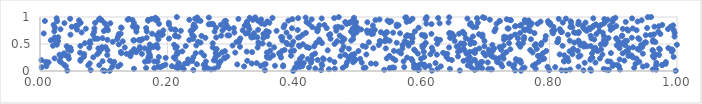
| Category | Series 0 |
|---|---|
| 0.3973890300934705 | 0.001 |
| 0.10145602287261213 | 0.002 |
| 0.10938902894747482 | 0.003 |
| 0.9979287383492613 | 0.004 |
| 0.7550871825981512 | 0.005 |
| 0.8651011881730192 | 0.006 |
| 0.6151875255150676 | 0.007 |
| 0.04285579661755712 | 0.008 |
| 0.8256534036813181 | 0.009 |
| 0.6589906973198936 | 0.01 |
| 0.7458257447315919 | 0.011 |
| 0.09906653998265813 | 0.012 |
| 0.8532120015228254 | 0.013 |
| 0.8187321625131625 | 0.014 |
| 0.3530781050278349 | 0.015 |
| 0.07954421915733279 | 0.016 |
| 0.7993456024274581 | 0.017 |
| 0.44116968283283975 | 0.018 |
| 0.24075158020275111 | 0.019 |
| 0.8928718810633416 | 0.02 |
| 0.6824224259435289 | 0.021 |
| 0.5934443066041453 | 0.022 |
| 0.5403308627490837 | 0.023 |
| 0.5947688931778354 | 0.024 |
| 0.9672745493603312 | 0.025 |
| 0.8888726562219799 | 0.026 |
| 0.9104271045630057 | 0.027 |
| 0.8322260000957703 | 0.028 |
| 0.2684752750521874 | 0.029 |
| 0.9618760338702196 | 0.03 |
| 0.7094858580460742 | 0.031 |
| 0.707569745450671 | 0.032 |
| 0.45365844930138577 | 0.033 |
| 0.8639271718592456 | 0.034 |
| 0.22567820221675283 | 0.035 |
| 0.7037346549840656 | 0.036 |
| 0.88496714286085 | 0.037 |
| 0.7781785855373956 | 0.038 |
| 0.6435621071395337 | 0.039 |
| 0.2583855647682398 | 0.04 |
| 0.14751264766658712 | 0.041 |
| 0.6241201028423417 | 0.042 |
| 0.4627803217535582 | 0.043 |
| 0.2738290032569164 | 0.044 |
| 0.6861048178813566 | 0.045 |
| 0.40122592603179963 | 0.046 |
| 0.43225511103234204 | 0.047 |
| 0.26358884745372324 | 0.048 |
| 0.21643727218727848 | 0.049 |
| 0.6941253898320315 | 0.05 |
| 0.5488991173098302 | 0.051 |
| 0.5490511297791335 | 0.052 |
| 0.758115351155932 | 0.053 |
| 0.17940014670018656 | 0.054 |
| 0.5082286117844772 | 0.055 |
| 0.16652284784157512 | 0.056 |
| 0.475308242299199 | 0.057 |
| 0.5871527133227742 | 0.058 |
| 0.9328075154947474 | 0.059 |
| 0.5560142840199664 | 0.06 |
| 0.40018071368963126 | 0.061 |
| 0.5110332690001114 | 0.062 |
| 0.760661549129893 | 0.063 |
| 0.6774669429533051 | 0.064 |
| 0.42231116567984095 | 0.065 |
| 0.5534748143618415 | 0.066 |
| 0.6915551657857393 | 0.067 |
| 0.22281446626942258 | 0.068 |
| 0.0026749785477455656 | 0.069 |
| 0.2133401913778462 | 0.07 |
| 0.189331830713528 | 0.071 |
| 0.8087822555828863 | 0.072 |
| 0.5716930328252531 | 0.073 |
| 0.6045163035065559 | 0.074 |
| 0.11326421852560375 | 0.075 |
| 0.7431013725020342 | 0.076 |
| 0.7967940664056057 | 0.077 |
| 0.40811481394989224 | 0.078 |
| 0.18508805564644926 | 0.079 |
| 0.27973770962019706 | 0.08 |
| 0.8454093880061371 | 0.081 |
| 0.9464673682434231 | 0.082 |
| 0.12245245344614208 | 0.083 |
| 0.7257016643789395 | 0.084 |
| 0.3203823394865567 | 0.085 |
| 0.629203401628143 | 0.086 |
| 0.38161837606238713 | 0.087 |
| 0.009916527906365769 | 0.088 |
| 0.908820807589899 | 0.089 |
| 0.2071487086372088 | 0.09 |
| 0.04060345580844216 | 0.091 |
| 0.4119835595408259 | 0.092 |
| 0.8988826517035206 | 0.093 |
| 0.19262887759247127 | 0.094 |
| 0.3466352136328644 | 0.095 |
| 0.611175892741034 | 0.096 |
| 0.36887123864116456 | 0.097 |
| 0.773905971472521 | 0.098 |
| 0.48027553786927235 | 0.099 |
| 0.5880555412174588 | 0.1 |
| 0.9525595859216636 | 0.101 |
| 0.4430464527832557 | 0.102 |
| 0.6716658288979078 | 0.103 |
| 0.38182845084281014 | 0.104 |
| 0.07567542942910077 | 0.105 |
| 0.9671789432071264 | 0.106 |
| 0.25904430145853885 | 0.107 |
| 0.09304020302335148 | 0.108 |
| 0.5946309707061453 | 0.109 |
| 0.9764075352348847 | 0.11 |
| 0.9062347305359234 | 0.111 |
| 0.9769137925200968 | 0.112 |
| 0.03816731025732267 | 0.113 |
| 0.2570113969868424 | 0.114 |
| 0.9010929060371862 | 0.115 |
| 0.12614102030482277 | 0.116 |
| 0.19682568250456112 | 0.117 |
| 0.7446346787106743 | 0.118 |
| 0.35142635464302496 | 0.119 |
| 0.6030938679835922 | 0.12 |
| 0.587202962025347 | 0.121 |
| 0.3096959108628322 | 0.122 |
| 0.690602832838305 | 0.123 |
| 0.5990926979542246 | 0.124 |
| 0.24641735209581006 | 0.125 |
| 0.010204410726921576 | 0.126 |
| 0.7777023491361135 | 0.127 |
| 0.4422638187113713 | 0.128 |
| 0.3542026295881464 | 0.129 |
| 0.6867395868835099 | 0.13 |
| 0.7234612327696814 | 0.131 |
| 0.9821886626398322 | 0.132 |
| 0.9348633887324656 | 0.133 |
| 0.5271459145736731 | 0.134 |
| 0.2174484284228464 | 0.135 |
| 0.7365832951509551 | 0.136 |
| 0.2274904761094142 | 0.137 |
| 0.3324327584315885 | 0.138 |
| 0.5195562015952441 | 0.139 |
| 0.2811150217462426 | 0.14 |
| 0.078095846898248 | 0.141 |
| 0.2319896897481747 | 0.142 |
| 0.40341349849653485 | 0.143 |
| 0.11503547962010086 | 0.144 |
| 0.21774230094317193 | 0.145 |
| 0.3402022332006057 | 0.146 |
| 0.6209273542612286 | 0.147 |
| 0.4140210646399316 | 0.148 |
| 0.4089701833194831 | 0.149 |
| 0.675418269837891 | 0.15 |
| 0.8551768060563761 | 0.151 |
| 0.9676191269089826 | 0.152 |
| 0.7550559186915174 | 0.153 |
| 0.4255651523685987 | 0.154 |
| 0.8719721124673732 | 0.155 |
| 0.5050844273906981 | 0.156 |
| 0.481778180729172 | 0.157 |
| 0.6750157099241024 | 0.158 |
| 0.7029610863962495 | 0.159 |
| 0.013451368009915754 | 0.16 |
| 0.03308600107930715 | 0.161 |
| 0.6920163198471202 | 0.162 |
| 0.49157329937958494 | 0.163 |
| 0.7177489573184356 | 0.164 |
| 0.46219662474729983 | 0.165 |
| 0.982543032630548 | 0.166 |
| 0.6940521125809695 | 0.167 |
| 0.009414532098761086 | 0.168 |
| 0.940906285028634 | 0.169 |
| 0.1164376687986991 | 0.17 |
| 0.7829066478190443 | 0.171 |
| 0.16485355403345336 | 0.172 |
| 0.184383923631245 | 0.173 |
| 0.8954614719898409 | 0.174 |
| 0.2604272317376852 | 0.175 |
| 0.8228927831098108 | 0.176 |
| 0.1794203277832177 | 0.177 |
| 0.5708476193371623 | 0.178 |
| 0.8910932345505453 | 0.179 |
| 0.2835905377258534 | 0.18 |
| 0.09824244734787302 | 0.181 |
| 0.8295917249789947 | 0.182 |
| 0.23913116355366226 | 0.183 |
| 0.17063496904379805 | 0.184 |
| 0.751781490639659 | 0.185 |
| 0.030810477360781907 | 0.186 |
| 0.8226740512913617 | 0.187 |
| 0.6648712404135151 | 0.188 |
| 0.32533395828896117 | 0.189 |
| 0.06346988593470804 | 0.19 |
| 0.10987450387874598 | 0.191 |
| 0.9172856454501171 | 0.192 |
| 0.584625279258606 | 0.193 |
| 0.751525110553338 | 0.194 |
| 0.7540433153995727 | 0.195 |
| 0.4943595655836803 | 0.196 |
| 0.2753086449304737 | 0.197 |
| 0.27285463376756525 | 0.198 |
| 0.6825904118526183 | 0.199 |
| 0.5578271225796889 | 0.2 |
| 0.002246080789714333 | 0.201 |
| 0.6713823735912484 | 0.202 |
| 0.646535633267846 | 0.203 |
| 0.43586939820124626 | 0.204 |
| 0.7484751715081891 | 0.205 |
| 0.6822977471403491 | 0.206 |
| 0.8639545973619948 | 0.207 |
| 0.42653312891112616 | 0.208 |
| 0.45484536131521625 | 0.209 |
| 0.7174143320900994 | 0.21 |
| 0.4947664115720224 | 0.211 |
| 0.06376969637438523 | 0.212 |
| 0.6708260857519641 | 0.213 |
| 0.9099328152187598 | 0.214 |
| 0.2325076434948813 | 0.215 |
| 0.48489066487907095 | 0.216 |
| 0.4454926922011826 | 0.217 |
| 0.788468973375737 | 0.218 |
| 0.7470340427078472 | 0.219 |
| 0.6412632635913377 | 0.22 |
| 0.40790820308068076 | 0.221 |
| 0.4204415963001794 | 0.222 |
| 0.583056343523627 | 0.223 |
| 0.5025652252828215 | 0.224 |
| 0.5981376066807192 | 0.225 |
| 0.21243249224731164 | 0.226 |
| 0.791598785904893 | 0.227 |
| 0.04530472403968022 | 0.228 |
| 0.7277330940322179 | 0.229 |
| 0.9365125718755333 | 0.23 |
| 0.8789301767186906 | 0.231 |
| 0.55397011181296 | 0.232 |
| 0.5444168402105094 | 0.233 |
| 0.022896603686551997 | 0.234 |
| 0.4443409592146642 | 0.235 |
| 0.49305523914700744 | 0.236 |
| 0.2901829827517515 | 0.237 |
| 0.8652592136881416 | 0.238 |
| 0.7209865811816288 | 0.239 |
| 0.17001039016900388 | 0.24 |
| 0.7147558268504596 | 0.241 |
| 0.8280771117708514 | 0.242 |
| 0.1972653000560427 | 0.243 |
| 0.8672152449578839 | 0.244 |
| 0.3608749525074145 | 0.245 |
| 0.28924707592704335 | 0.246 |
| 0.9639006803812122 | 0.247 |
| 0.3569770018456815 | 0.248 |
| 0.5762532062652346 | 0.249 |
| 0.37839895123611467 | 0.25 |
| 0.931044567622365 | 0.251 |
| 0.674840976450389 | 0.252 |
| 0.2100841618336915 | 0.253 |
| 0.08369248083093284 | 0.254 |
| 0.24083079958340825 | 0.255 |
| 0.2754652444287309 | 0.256 |
| 0.17290394707578516 | 0.257 |
| 0.48421197947309513 | 0.258 |
| 0.1865065915041786 | 0.259 |
| 0.6030211537272209 | 0.26 |
| 0.9946724209780581 | 0.261 |
| 0.6379561413128684 | 0.262 |
| 0.06878935712216727 | 0.263 |
| 0.8454492311269639 | 0.264 |
| 0.7101639881402737 | 0.265 |
| 0.4115312797304721 | 0.266 |
| 0.03309007013935905 | 0.267 |
| 0.9294963371828189 | 0.268 |
| 0.35621032602449954 | 0.269 |
| 0.6562402772303452 | 0.27 |
| 0.29394386662578853 | 0.271 |
| 0.7829494303655868 | 0.272 |
| 0.17064063770301774 | 0.273 |
| 0.47150272680496796 | 0.274 |
| 0.14195063845359013 | 0.275 |
| 0.9620606320501099 | 0.276 |
| 0.35692365228627887 | 0.277 |
| 0.4889726659104988 | 0.278 |
| 0.9238091342269705 | 0.279 |
| 0.7817343880154757 | 0.28 |
| 0.04427176761384255 | 0.281 |
| 0.548480799211173 | 0.282 |
| 0.39405986752861843 | 0.283 |
| 0.7859449765069385 | 0.284 |
| 0.8483390068315592 | 0.285 |
| 0.25766859874512704 | 0.286 |
| 0.6993406904449877 | 0.287 |
| 0.9287424164613358 | 0.288 |
| 0.04034537586305409 | 0.289 |
| 0.3659029211153235 | 0.29 |
| 0.8230993061572326 | 0.291 |
| 0.4273334249860188 | 0.292 |
| 0.7270811539739932 | 0.293 |
| 0.7073315723548954 | 0.294 |
| 0.37707926175297213 | 0.295 |
| 0.1055760973498292 | 0.296 |
| 0.1723432551755052 | 0.297 |
| 0.971939770960243 | 0.298 |
| 0.27999542972695646 | 0.299 |
| 0.4896363057827797 | 0.3 |
| 0.4789237041286851 | 0.301 |
| 0.030586605003563694 | 0.302 |
| 0.6230845306472231 | 0.303 |
| 0.708672197558105 | 0.304 |
| 0.8828905920255028 | 0.305 |
| 0.5123239055725933 | 0.306 |
| 0.8157809379101644 | 0.307 |
| 0.9664326245752145 | 0.308 |
| 0.21483525593957986 | 0.309 |
| 0.6127774413040399 | 0.31 |
| 0.8359206642177892 | 0.311 |
| 0.09006061791952813 | 0.312 |
| 0.06935641821394622 | 0.313 |
| 0.4936053861037142 | 0.314 |
| 0.6369645886667064 | 0.315 |
| 0.16007230527985328 | 0.316 |
| 0.6392793442134181 | 0.317 |
| 0.13576522811861458 | 0.318 |
| 0.1429036847134686 | 0.319 |
| 0.6696117089489002 | 0.32 |
| 0.9463946329642846 | 0.321 |
| 0.593233816775882 | 0.322 |
| 0.4319185622511108 | 0.323 |
| 0.8665987955923508 | 0.324 |
| 0.5668143751740112 | 0.325 |
| 0.03752156666347328 | 0.326 |
| 0.9146886863804568 | 0.327 |
| 0.127628596173044 | 0.328 |
| 0.7895108970783938 | 0.329 |
| 0.2443871403256196 | 0.33 |
| 0.3754233395462361 | 0.331 |
| 0.8962344326919324 | 0.332 |
| 0.275763803612576 | 0.333 |
| 0.682801993136227 | 0.334 |
| 0.6961651919289874 | 0.335 |
| 0.2153821963668705 | 0.336 |
| 0.6327848042572735 | 0.337 |
| 0.21614856525654624 | 0.338 |
| 0.06299319359012823 | 0.339 |
| 0.253247029100245 | 0.34 |
| 0.3065090771523161 | 0.341 |
| 0.35617985939376096 | 0.342 |
| 0.773307871210165 | 0.343 |
| 0.28575272082457315 | 0.344 |
| 0.21729277907887934 | 0.345 |
| 0.14291040567406033 | 0.346 |
| 0.7319627111675007 | 0.347 |
| 0.09274929539473742 | 0.348 |
| 0.15114289331404562 | 0.349 |
| 0.33304843473911594 | 0.35 |
| 0.17064594765352692 | 0.351 |
| 0.7050651064645282 | 0.352 |
| 0.674826873803619 | 0.353 |
| 0.12706989509531574 | 0.354 |
| 0.6562725834432711 | 0.355 |
| 0.6025323592239172 | 0.356 |
| 0.9919432249948831 | 0.357 |
| 0.6799278636254865 | 0.358 |
| 0.32458903673554296 | 0.359 |
| 0.9229926321146426 | 0.36 |
| 0.5626174064286126 | 0.361 |
| 0.9199506763841483 | 0.362 |
| 0.14846612186496644 | 0.363 |
| 0.22347575756811922 | 0.364 |
| 0.8313425392409092 | 0.365 |
| 0.39394018022839705 | 0.366 |
| 0.8751477484426543 | 0.367 |
| 0.29024903673475466 | 0.368 |
| 0.37971753894644567 | 0.369 |
| 0.49993130288988363 | 0.37 |
| 0.7947267313499472 | 0.371 |
| 0.5556165427270585 | 0.372 |
| 0.36109725447039 | 0.373 |
| 0.844189891714207 | 0.374 |
| 0.6166525414963135 | 0.375 |
| 0.5889249072246022 | 0.376 |
| 0.6665856548392279 | 0.377 |
| 0.3987635868992512 | 0.378 |
| 0.048630657257007104 | 0.379 |
| 0.6598199404584998 | 0.38 |
| 0.10591554854132557 | 0.381 |
| 0.9617540711517368 | 0.382 |
| 0.45165471411401914 | 0.383 |
| 0.9618682167496141 | 0.384 |
| 0.7113135065376645 | 0.385 |
| 0.9932234923411836 | 0.386 |
| 0.47372701854165955 | 0.387 |
| 0.6836272011435807 | 0.388 |
| 0.7696095233249683 | 0.389 |
| 0.38405063386411187 | 0.39 |
| 0.8696287249266644 | 0.391 |
| 0.7240579696557291 | 0.392 |
| 0.9403696100111953 | 0.393 |
| 0.044366467830644685 | 0.394 |
| 0.7045815028116464 | 0.395 |
| 0.5874285958137483 | 0.396 |
| 0.8374969914061838 | 0.397 |
| 0.9731868473456327 | 0.398 |
| 0.276400019912901 | 0.399 |
| 0.8809354586755825 | 0.4 |
| 0.9919040395669667 | 0.401 |
| 0.7383430520137717 | 0.402 |
| 0.09610538250552114 | 0.403 |
| 0.14752596551423458 | 0.404 |
| 0.17115759314708956 | 0.405 |
| 0.1560662567635167 | 0.406 |
| 0.27725324990449907 | 0.407 |
| 0.779872790348918 | 0.408 |
| 0.938207488639319 | 0.409 |
| 0.17037904142136706 | 0.41 |
| 0.8370339686289303 | 0.411 |
| 0.6647735479899498 | 0.412 |
| 0.48491310102930807 | 0.413 |
| 0.9719636637697403 | 0.414 |
| 0.5688671587426839 | 0.415 |
| 0.7128226594625063 | 0.416 |
| 0.6897247922349822 | 0.417 |
| 0.5428238951522646 | 0.418 |
| 0.09163165168834175 | 0.419 |
| 0.1643899780761321 | 0.42 |
| 0.5233023341361728 | 0.421 |
| 0.9239260606177988 | 0.422 |
| 0.9097442119982047 | 0.423 |
| 0.2127412297362946 | 0.424 |
| 0.9864253055338219 | 0.425 |
| 0.04596062261779377 | 0.426 |
| 0.8719732495423856 | 0.427 |
| 0.4222621656943887 | 0.428 |
| 0.04792674564293631 | 0.429 |
| 0.6152234515998372 | 0.43 |
| 0.1847626954484003 | 0.431 |
| 0.07754885897612163 | 0.432 |
| 0.6007821287650283 | 0.433 |
| 0.34156584682373026 | 0.434 |
| 0.13313503159802886 | 0.435 |
| 0.6421998776568741 | 0.436 |
| 0.3675426856690237 | 0.437 |
| 0.27114877768148904 | 0.438 |
| 0.9309098298665072 | 0.439 |
| 0.10311093670308491 | 0.44 |
| 0.09742488806075089 | 0.441 |
| 0.7212101424490905 | 0.442 |
| 0.1566255435826024 | 0.443 |
| 0.4187408843792787 | 0.444 |
| 0.9455181165622801 | 0.445 |
| 0.2147468761371527 | 0.446 |
| 0.1776777830990468 | 0.447 |
| 0.31390510830214957 | 0.448 |
| 0.5114044696743615 | 0.449 |
| 0.7540324643619813 | 0.45 |
| 0.47673577503403464 | 0.451 |
| 0.8539543009968501 | 0.452 |
| 0.654085208938723 | 0.453 |
| 0.1783739141233689 | 0.454 |
| 0.4074014646908828 | 0.455 |
| 0.4303752096246436 | 0.456 |
| 0.8587861864557532 | 0.457 |
| 0.6976714462392464 | 0.458 |
| 0.04195108350560339 | 0.459 |
| 0.18240350663330962 | 0.46 |
| 0.8646882493384931 | 0.461 |
| 0.6567938529496764 | 0.462 |
| 0.228742294858706 | 0.463 |
| 0.06335442219267884 | 0.464 |
| 0.5067560421672062 | 0.465 |
| 0.8203655973808036 | 0.466 |
| 0.6001151488592288 | 0.467 |
| 0.02033894374393652 | 0.468 |
| 0.5786468350446068 | 0.469 |
| 0.3023135697350441 | 0.47 |
| 0.7277561524623939 | 0.471 |
| 0.4065195594704344 | 0.472 |
| 0.24539280068514857 | 0.473 |
| 0.9053340868216266 | 0.474 |
| 0.8483513025830046 | 0.475 |
| 0.7765879908081814 | 0.476 |
| 0.39500881551592215 | 0.477 |
| 0.943509533340976 | 0.478 |
| 0.6031369362883692 | 0.479 |
| 0.5691220282154562 | 0.48 |
| 0.5318941696084288 | 0.481 |
| 0.9182110236835637 | 0.482 |
| 0.7100520376222323 | 0.483 |
| 0.7864576615616226 | 0.484 |
| 0.21055065990098432 | 0.485 |
| 0.9998072082136817 | 0.486 |
| 0.026482647693172212 | 0.487 |
| 0.18324463335402097 | 0.488 |
| 0.6653264247731757 | 0.489 |
| 0.17234022703271523 | 0.49 |
| 0.36000738007558675 | 0.491 |
| 0.12364227264364602 | 0.492 |
| 0.8865773308465872 | 0.493 |
| 0.8804859333679809 | 0.494 |
| 0.4127880162272851 | 0.495 |
| 0.7515253737674206 | 0.496 |
| 0.7781449115337115 | 0.497 |
| 0.34345956956277435 | 0.498 |
| 0.3880911651059029 | 0.499 |
| 0.46255622420838105 | 0.5 |
| 0.6756566269398679 | 0.501 |
| 0.9475931343000988 | 0.502 |
| 0.8480802066132559 | 0.503 |
| 0.623758307224823 | 0.504 |
| 0.9137291859095669 | 0.505 |
| 0.5773003255849096 | 0.506 |
| 0.8538709190381238 | 0.507 |
| 0.07900026977174801 | 0.508 |
| 0.3494758452845552 | 0.509 |
| 0.7513846484782613 | 0.51 |
| 0.6603970433943579 | 0.511 |
| 0.6655243632614092 | 0.512 |
| 0.2712032174323372 | 0.513 |
| 0.7580077825666155 | 0.514 |
| 0.07044716259300188 | 0.515 |
| 0.7362980801219308 | 0.516 |
| 0.44261000745595636 | 0.517 |
| 0.7873713894372607 | 0.518 |
| 0.6818195467518537 | 0.519 |
| 0.6055932280262645 | 0.52 |
| 0.4336679950492791 | 0.521 |
| 0.38704763681675247 | 0.522 |
| 0.5600331611408789 | 0.523 |
| 0.5763318916253961 | 0.524 |
| 0.838867452565219 | 0.525 |
| 0.9162266747359001 | 0.526 |
| 0.25211414156106327 | 0.527 |
| 0.9512289680547825 | 0.528 |
| 0.8882298402681155 | 0.529 |
| 0.3428491963149619 | 0.53 |
| 0.9501185602035822 | 0.531 |
| 0.5162696328052538 | 0.532 |
| 0.8120094220764562 | 0.533 |
| 0.5840535842613628 | 0.534 |
| 0.44128646011368466 | 0.535 |
| 0.9660032253948498 | 0.536 |
| 0.3085139140353603 | 0.537 |
| 0.908785448571468 | 0.538 |
| 0.2479185399145205 | 0.539 |
| 0.1142761325134255 | 0.54 |
| 0.4745416541406282 | 0.541 |
| 0.3976234065628744 | 0.542 |
| 0.8459283301716446 | 0.543 |
| 0.9620725040835086 | 0.544 |
| 0.8130451747635606 | 0.545 |
| 0.5351634593584823 | 0.546 |
| 0.31264436706795773 | 0.547 |
| 0.07819827054749084 | 0.548 |
| 0.12983359539351036 | 0.549 |
| 0.5724242421237797 | 0.55 |
| 0.46646203075560266 | 0.551 |
| 0.6766192562532798 | 0.552 |
| 0.5416131777549861 | 0.553 |
| 0.028303092310702382 | 0.554 |
| 0.5332972871947745 | 0.555 |
| 0.697761434415247 | 0.556 |
| 0.6509459203894843 | 0.557 |
| 0.9190876983220727 | 0.558 |
| 0.9214128742163362 | 0.559 |
| 0.02392631469236073 | 0.56 |
| 0.5489037236238329 | 0.561 |
| 0.8317046666263581 | 0.562 |
| 0.8452830208090985 | 0.563 |
| 0.48856887316629505 | 0.564 |
| 0.38043027189533807 | 0.565 |
| 0.15795165367895114 | 0.566 |
| 0.14761255834656728 | 0.567 |
| 0.1465473878796688 | 0.568 |
| 0.01699107091000518 | 0.569 |
| 0.5456866558004263 | 0.57 |
| 0.8852695285851823 | 0.571 |
| 0.9625430885312298 | 0.572 |
| 0.23434804215817673 | 0.573 |
| 0.15516560751455577 | 0.574 |
| 0.6743842587762806 | 0.575 |
| 0.6280009831627434 | 0.576 |
| 0.1564875151809184 | 0.577 |
| 0.10589442649855418 | 0.578 |
| 0.3132842036502287 | 0.579 |
| 0.72826881805406 | 0.58 |
| 0.7932007732564699 | 0.581 |
| 0.9060919956010399 | 0.582 |
| 0.438462959393928 | 0.583 |
| 0.8701363179164149 | 0.584 |
| 0.7595333939577524 | 0.585 |
| 0.9410060151937535 | 0.586 |
| 0.1858910243345916 | 0.587 |
| 0.7707666540131956 | 0.588 |
| 0.6225733279090144 | 0.589 |
| 0.1606661557151582 | 0.59 |
| 0.4778304050452026 | 0.591 |
| 0.49150570527232207 | 0.592 |
| 0.12121365726034039 | 0.593 |
| 0.5431684753400399 | 0.594 |
| 0.2401731308382552 | 0.595 |
| 0.8137285894858278 | 0.596 |
| 0.45615070900670673 | 0.597 |
| 0.09066686286729508 | 0.598 |
| 0.08545651535032728 | 0.599 |
| 0.20256921651197812 | 0.6 |
| 0.08736506622750762 | 0.601 |
| 0.865593764565939 | 0.602 |
| 0.584788035983968 | 0.603 |
| 0.3144763253121782 | 0.604 |
| 0.7503271343632698 | 0.605 |
| 0.9044485638073959 | 0.606 |
| 0.09799144514236657 | 0.607 |
| 0.9392149956947876 | 0.608 |
| 0.350536316206859 | 0.609 |
| 0.6684579666895115 | 0.61 |
| 0.8924925242435026 | 0.611 |
| 0.6439148837577517 | 0.612 |
| 0.7365591158575835 | 0.613 |
| 0.4750844723202108 | 0.614 |
| 0.2596990541466473 | 0.615 |
| 0.16747508790636756 | 0.616 |
| 0.9290669774409953 | 0.617 |
| 0.4052721475779597 | 0.618 |
| 0.33199594389552756 | 0.619 |
| 0.5841798649380661 | 0.62 |
| 0.27661383665643313 | 0.621 |
| 0.022910418326809845 | 0.622 |
| 0.7319191942671168 | 0.623 |
| 0.38042259047546845 | 0.624 |
| 0.028518637067446284 | 0.625 |
| 0.3410752595531523 | 0.626 |
| 0.40779966536503676 | 0.627 |
| 0.7600722964089356 | 0.628 |
| 0.37850144492791127 | 0.629 |
| 0.3360777450807447 | 0.63 |
| 0.3918876707606853 | 0.631 |
| 0.6946433828477304 | 0.632 |
| 0.12250640909648525 | 0.633 |
| 0.6044258413221374 | 0.634 |
| 0.728666542609051 | 0.635 |
| 0.2173561783605421 | 0.636 |
| 0.9961148818668983 | 0.637 |
| 0.24154207654848092 | 0.638 |
| 0.7392497117272337 | 0.639 |
| 0.6796241222854187 | 0.64 |
| 0.33170085685207784 | 0.641 |
| 0.5745771450091467 | 0.642 |
| 0.33254990977373866 | 0.643 |
| 0.3566935701284556 | 0.644 |
| 0.9134059006468113 | 0.645 |
| 0.21235295966307954 | 0.646 |
| 0.7939074525947711 | 0.647 |
| 0.5806471401400327 | 0.648 |
| 0.8851432309984886 | 0.649 |
| 0.6496762793092717 | 0.65 |
| 0.25355510527562397 | 0.651 |
| 0.5843487857462876 | 0.652 |
| 0.8645387806756385 | 0.653 |
| 0.28438054098830745 | 0.654 |
| 0.4705057192513026 | 0.655 |
| 0.9140428148562313 | 0.656 |
| 0.6936722357543695 | 0.657 |
| 0.2971076860265637 | 0.658 |
| 0.18332122262931472 | 0.659 |
| 0.2942916114253946 | 0.66 |
| 0.21221390362814385 | 0.661 |
| 0.6037771662468244 | 0.662 |
| 0.950948565415824 | 0.663 |
| 0.5765482369671578 | 0.664 |
| 0.190840981935524 | 0.665 |
| 0.4921787540677355 | 0.666 |
| 0.45372046445869874 | 0.667 |
| 0.599485156696513 | 0.668 |
| 0.9584339490173327 | 0.669 |
| 0.23893268827128622 | 0.67 |
| 0.8287486585039572 | 0.671 |
| 0.41241003001249366 | 0.672 |
| 0.047847687162653196 | 0.673 |
| 0.6946578581330655 | 0.674 |
| 0.7456988955832362 | 0.675 |
| 0.08336793227943873 | 0.676 |
| 0.1926647192984583 | 0.677 |
| 0.963804012571109 | 0.678 |
| 0.541215234997536 | 0.679 |
| 0.6891275581516056 | 0.68 |
| 0.45579747446426455 | 0.681 |
| 0.12363215741094957 | 0.682 |
| 0.520815211176421 | 0.683 |
| 0.35066261322648207 | 0.684 |
| 0.8734912928209343 | 0.685 |
| 0.973877209072386 | 0.686 |
| 0.6662082376220684 | 0.687 |
| 0.6144525639616807 | 0.688 |
| 0.657934537122582 | 0.689 |
| 0.17600877832033457 | 0.69 |
| 0.1266704717417616 | 0.691 |
| 0.5230581814637012 | 0.692 |
| 0.6466354172832528 | 0.693 |
| 0.32288737191268957 | 0.694 |
| 0.005883405706207823 | 0.695 |
| 0.6423780084259261 | 0.696 |
| 0.8054059370297898 | 0.697 |
| 0.5652610204734602 | 0.698 |
| 0.3359152075723232 | 0.699 |
| 0.8453136459513405 | 0.7 |
| 0.7762993227097248 | 0.701 |
| 0.3262408511747442 | 0.702 |
| 0.7535872817882833 | 0.703 |
| 0.643168064300512 | 0.704 |
| 0.9962453908369583 | 0.705 |
| 0.41739826283290793 | 0.706 |
| 0.8406486771816128 | 0.707 |
| 0.5141258867020237 | 0.708 |
| 0.5543362919020278 | 0.709 |
| 0.883431207492274 | 0.71 |
| 0.18709284151144245 | 0.711 |
| 0.3870403043723547 | 0.712 |
| 0.30516439069109447 | 0.713 |
| 0.06531783432999305 | 0.714 |
| 0.8383098114564064 | 0.715 |
| 0.5437951696976575 | 0.716 |
| 0.5446453681116242 | 0.717 |
| 0.49726107172977885 | 0.718 |
| 0.5352822752329559 | 0.719 |
| 0.8192506985188736 | 0.72 |
| 0.8457847241053096 | 0.721 |
| 0.35917232885042794 | 0.722 |
| 0.08503355484399677 | 0.723 |
| 0.8188176548932358 | 0.724 |
| 0.5174945137959474 | 0.725 |
| 0.8178514581014155 | 0.726 |
| 0.6636549612857593 | 0.727 |
| 0.15134483605396087 | 0.728 |
| 0.970685771894946 | 0.729 |
| 0.4883095910151345 | 0.73 |
| 0.27418231511314595 | 0.731 |
| 0.16754285431296145 | 0.732 |
| 0.5885933687495233 | 0.733 |
| 0.022434064785601726 | 0.734 |
| 0.43538911473669295 | 0.735 |
| 0.7134293981438192 | 0.736 |
| 0.35530970947301177 | 0.737 |
| 0.8779261003563187 | 0.738 |
| 0.7694108374797473 | 0.739 |
| 0.8042814822834945 | 0.74 |
| 0.10037290427364887 | 0.741 |
| 0.23648833104716882 | 0.742 |
| 0.3713754053094297 | 0.743 |
| 0.858492951854885 | 0.744 |
| 0.22105452465355757 | 0.745 |
| 0.4651267263689227 | 0.746 |
| 0.9235260277643189 | 0.747 |
| 0.5200555625628925 | 0.748 |
| 0.5132110768485123 | 0.749 |
| 0.2864797686088698 | 0.75 |
| 0.1936418229844279 | 0.751 |
| 0.8077418872093509 | 0.752 |
| 0.31821157250779764 | 0.753 |
| 0.10670986701785445 | 0.754 |
| 0.7611565218906241 | 0.755 |
| 0.9366135231059385 | 0.756 |
| 0.7671993678804355 | 0.757 |
| 0.21265124091965149 | 0.758 |
| 0.9947311714073648 | 0.759 |
| 0.40464883066924273 | 0.76 |
| 0.5256099198271712 | 0.761 |
| 0.8959138388815744 | 0.762 |
| 0.34245678563357607 | 0.763 |
| 0.43629328335342976 | 0.764 |
| 0.24017541787434626 | 0.765 |
| 0.8556071127342948 | 0.766 |
| 0.058020042475891875 | 0.767 |
| 0.211696029505558 | 0.768 |
| 0.5041646199747533 | 0.769 |
| 0.7596533049234556 | 0.77 |
| 0.921596049193661 | 0.771 |
| 0.7642529810934844 | 0.772 |
| 0.032217929468600914 | 0.773 |
| 0.32874145247709285 | 0.774 |
| 0.8160066107858327 | 0.775 |
| 0.8636366078647598 | 0.776 |
| 0.9858663286594235 | 0.777 |
| 0.20577853994796813 | 0.778 |
| 0.15098887083381063 | 0.779 |
| 0.9149591201209017 | 0.78 |
| 0.715276569425718 | 0.781 |
| 0.43450756607827334 | 0.782 |
| 0.07198688555330357 | 0.783 |
| 0.7355963576200731 | 0.784 |
| 0.4907371570916005 | 0.785 |
| 0.2971040657941846 | 0.786 |
| 0.49495893136085944 | 0.787 |
| 0.08546629674463957 | 0.788 |
| 0.930469609631554 | 0.789 |
| 0.734091717244342 | 0.79 |
| 0.3955382879314988 | 0.791 |
| 0.8614830183590895 | 0.792 |
| 0.45008949633654083 | 0.793 |
| 0.3042690211183938 | 0.794 |
| 0.16662946121265843 | 0.795 |
| 0.8994853122946915 | 0.796 |
| 0.9531546819995264 | 0.797 |
| 0.1280238535928795 | 0.798 |
| 0.8527510122866154 | 0.799 |
| 0.49857327955730557 | 0.8 |
| 0.27632946623132826 | 0.801 |
| 0.5943322596989866 | 0.802 |
| 0.2901933608208217 | 0.803 |
| 0.023279317863298066 | 0.804 |
| 0.473613274432406 | 0.805 |
| 0.12735744414222594 | 0.806 |
| 0.10483550848638723 | 0.807 |
| 0.3824312020042745 | 0.808 |
| 0.46412945539487604 | 0.809 |
| 0.15212945882887563 | 0.81 |
| 0.8357094556142828 | 0.811 |
| 0.24389274808750316 | 0.812 |
| 0.4273377551632127 | 0.813 |
| 0.8325742667522795 | 0.814 |
| 0.6847684360796542 | 0.815 |
| 0.6797650059748831 | 0.816 |
| 0.8675525094172799 | 0.817 |
| 0.46809244214659373 | 0.818 |
| 0.04990214158527362 | 0.819 |
| 0.805926858496612 | 0.82 |
| 0.9645026372101014 | 0.821 |
| 0.9901201210084812 | 0.822 |
| 0.8776224568632511 | 0.823 |
| 0.14847091386600741 | 0.824 |
| 0.24077110628502496 | 0.825 |
| 0.7457460504956296 | 0.826 |
| 0.14575774714235923 | 0.827 |
| 0.9713349087921859 | 0.828 |
| 0.560142291706 | 0.829 |
| 0.05632922683700703 | 0.83 |
| 0.746261233564975 | 0.831 |
| 0.9046615061923917 | 0.832 |
| 0.05651982973789238 | 0.833 |
| 0.3268450570281547 | 0.834 |
| 0.833640828742833 | 0.835 |
| 0.3256617084677286 | 0.836 |
| 0.8948750971955612 | 0.837 |
| 0.8689827564460179 | 0.838 |
| 0.32131453421047607 | 0.839 |
| 0.7696181341745115 | 0.84 |
| 0.7534644481541873 | 0.841 |
| 0.8522465889517314 | 0.842 |
| 0.5225627022725765 | 0.843 |
| 0.49508510008738316 | 0.844 |
| 0.9938794362431161 | 0.845 |
| 0.4385769793324845 | 0.846 |
| 0.5629347909987953 | 0.847 |
| 0.05949920160517319 | 0.848 |
| 0.2929888395820731 | 0.849 |
| 0.8802259518983234 | 0.85 |
| 0.38393299439496564 | 0.851 |
| 0.4465527309635514 | 0.852 |
| 0.9768815814516759 | 0.853 |
| 0.021407892923180682 | 0.854 |
| 0.7680034390069393 | 0.855 |
| 0.28394553769119624 | 0.856 |
| 0.8009733947884028 | 0.857 |
| 0.7558404733508878 | 0.858 |
| 0.5598694038645465 | 0.859 |
| 0.20241478798732349 | 0.86 |
| 0.6748540481478892 | 0.861 |
| 0.24157866189065247 | 0.862 |
| 0.8726329740061183 | 0.863 |
| 0.26483672089517907 | 0.864 |
| 0.8449611100067895 | 0.865 |
| 0.35270181352025465 | 0.866 |
| 0.2718270709361844 | 0.867 |
| 0.6145986858919799 | 0.868 |
| 0.27056197288304595 | 0.869 |
| 0.494040095372433 | 0.87 |
| 0.26803806857860835 | 0.871 |
| 0.48122472572260333 | 0.872 |
| 0.18684559624788188 | 0.873 |
| 0.42214533627573647 | 0.874 |
| 0.7810435032372759 | 0.875 |
| 0.7167514163281501 | 0.876 |
| 0.6065309094358687 | 0.877 |
| 0.885008927993396 | 0.878 |
| 0.34761977187380766 | 0.879 |
| 0.7719516083609756 | 0.88 |
| 0.32445101100312956 | 0.881 |
| 0.101896704814747 | 0.882 |
| 0.6273009952749278 | 0.883 |
| 0.11040049029110643 | 0.884 |
| 0.6761394102447048 | 0.885 |
| 0.7984434561758743 | 0.886 |
| 0.03833080082754159 | 0.887 |
| 0.8008226799817184 | 0.888 |
| 0.48610325335259896 | 0.889 |
| 0.14744564304470076 | 0.89 |
| 0.08648060473500752 | 0.891 |
| 0.06387677341639353 | 0.892 |
| 0.20224507024557137 | 0.893 |
| 0.36018696685149376 | 0.894 |
| 0.6874071516773964 | 0.895 |
| 0.8206954616598755 | 0.896 |
| 0.8564539869633772 | 0.897 |
| 0.6412917920334121 | 0.898 |
| 0.48596665091737024 | 0.899 |
| 0.8338538616162056 | 0.9 |
| 0.32468204111701326 | 0.901 |
| 0.5139804799481086 | 0.902 |
| 0.5485726983632454 | 0.903 |
| 0.7622635162897659 | 0.904 |
| 0.4183957102561474 | 0.905 |
| 0.49603808922356696 | 0.906 |
| 0.47918512280361814 | 0.907 |
| 0.34617874921159786 | 0.908 |
| 0.9195381849102905 | 0.909 |
| 0.5756251132451815 | 0.91 |
| 0.8872973982053718 | 0.911 |
| 0.8988698450976039 | 0.912 |
| 0.8454964203523558 | 0.913 |
| 0.32501950746447206 | 0.914 |
| 0.7857976338456545 | 0.915 |
| 0.9381666446938738 | 0.916 |
| 0.5489268429080586 | 0.917 |
| 0.3568739167754963 | 0.918 |
| 0.5511262579490391 | 0.919 |
| 0.8331122760006989 | 0.92 |
| 0.28966713412403966 | 0.921 |
| 0.797468205723633 | 0.922 |
| 0.7214683649093442 | 0.923 |
| 0.026972246077087147 | 0.924 |
| 0.7218365689741529 | 0.925 |
| 0.007683505916269429 | 0.926 |
| 0.25203946609201866 | 0.927 |
| 0.5806239360338239 | 0.928 |
| 0.29178695349291306 | 0.929 |
| 0.16985650046609135 | 0.93 |
| 0.34213097998074493 | 0.931 |
| 0.5455481524324024 | 0.932 |
| 0.3898969338494772 | 0.933 |
| 0.4905420809605666 | 0.934 |
| 0.24792455945967906 | 0.935 |
| 0.7672227975731242 | 0.936 |
| 0.09705188185309799 | 0.937 |
| 0.061278278965601785 | 0.938 |
| 0.9445175501760752 | 0.939 |
| 0.7393543484092682 | 0.94 |
| 0.18215009565793994 | 0.941 |
| 0.5266466957003225 | 0.942 |
| 0.7609659155277315 | 0.943 |
| 0.7376429370751498 | 0.944 |
| 0.1451525630931484 | 0.945 |
| 0.169648911547024 | 0.946 |
| 0.3340483636387608 | 0.947 |
| 0.23448308849031885 | 0.948 |
| 0.8909844395428815 | 0.949 |
| 0.7062304020533321 | 0.95 |
| 0.13749688923351322 | 0.951 |
| 0.09230513701085397 | 0.952 |
| 0.18440669967888035 | 0.953 |
| 0.5330207977925769 | 0.954 |
| 0.3472350851980457 | 0.955 |
| 0.4265068351496607 | 0.956 |
| 0.24828365257114726 | 0.957 |
| 0.7326736988611066 | 0.958 |
| 0.605717301820101 | 0.959 |
| 0.396023147284876 | 0.96 |
| 0.8859430103562067 | 0.961 |
| 0.8998637476669357 | 0.962 |
| 0.13962663531056485 | 0.963 |
| 0.31144773479670673 | 0.964 |
| 0.8142979131099262 | 0.965 |
| 0.17520786562603508 | 0.966 |
| 0.047289440441188324 | 0.967 |
| 0.5847686219712538 | 0.968 |
| 0.24354520616280895 | 0.969 |
| 0.8256257612404476 | 0.97 |
| 0.670957612175272 | 0.971 |
| 0.09382715014732856 | 0.972 |
| 0.44222129781173747 | 0.973 |
| 0.9294331117208042 | 0.974 |
| 0.86858097164017 | 0.975 |
| 0.02604265731352473 | 0.976 |
| 0.6861058773043148 | 0.977 |
| 0.4052419357895801 | 0.978 |
| 0.46188197876978665 | 0.979 |
| 0.6063808502453958 | 0.98 |
| 0.6250350152065975 | 0.981 |
| 0.6978136711222854 | 0.982 |
| 0.36498714504366403 | 0.983 |
| 0.9031744319831932 | 0.984 |
| 0.4929890166892653 | 0.985 |
| 0.3292614975419521 | 0.986 |
| 0.18119958353845433 | 0.987 |
| 0.5734367966659395 | 0.988 |
| 0.41699726320695063 | 0.989 |
| 0.26507259385258375 | 0.99 |
| 0.2468852853182667 | 0.991 |
| 0.575022197576788 | 0.992 |
| 0.3379112453384746 | 0.993 |
| 0.6424586707596835 | 0.994 |
| 0.6951738484291031 | 0.995 |
| 0.6068789635583528 | 0.996 |
| 0.9541155705509344 | 0.997 |
| 0.4690319950857994 | 0.998 |
| 0.21484366702153546 | 0.999 |
| 0.9593076397959879 | 1 |